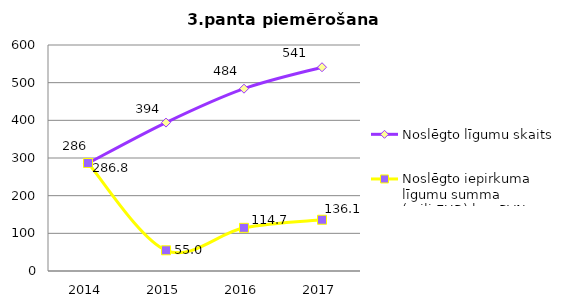
| Category | Noslēgto līgumu skaits | Noslēgto iepirkuma līgumu summa (milj.EUR) bez PVN |
|---|---|---|
| 2014.0 | 286 | 286.751 |
| 2015.0 | 394 | 54.993 |
| 2016.0 | 484 | 114.654 |
| 2017.0 | 541 | 136.1 |